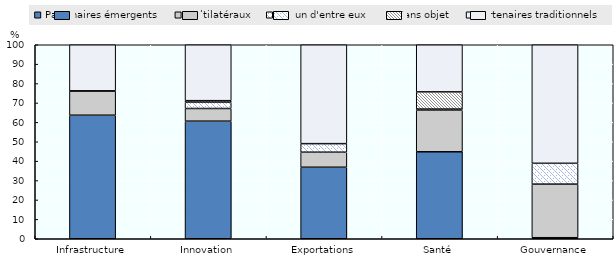
| Category | Partenaires émergents | Multilatéraux | Aucun d'entre eux  | Sans objet | Partenaires traditionnels |
|---|---|---|---|---|---|
| Infrastructure | 63.681 | 12.472 | 0 | 0.098 | 23.749 |
| Innovation | 60.611 | 6.533 | 3.224 | 0.802 | 28.83 |
| Exportations | 36.859 | 7.751 | 4.408 | 0 | 50.981 |
| Santé | 44.836 | 21.424 | 0.589 | 8.857 | 24.294 |
| Gouvernance | 0.53 | 27.634 | 10.728 | 0 | 61.108 |